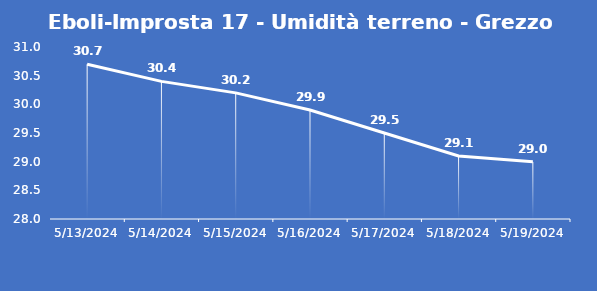
| Category | Eboli-Improsta 17 - Umidità terreno - Grezzo (%VWC) |
|---|---|
| 5/13/24 | 30.7 |
| 5/14/24 | 30.4 |
| 5/15/24 | 30.2 |
| 5/16/24 | 29.9 |
| 5/17/24 | 29.5 |
| 5/18/24 | 29.1 |
| 5/19/24 | 29 |